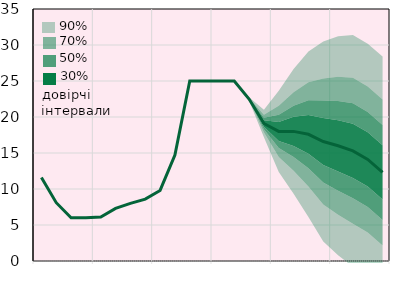
| Category | Облікова ставка, % |
|---|---|
|  | 11.6 |
|  | 8.1 |
|  | 6 |
| IV.20 | 6 |
|  | 6.1 |
|  | 7.3 |
|  | 8 |
| IV.21 | 8.6 |
|  | 9.8 |
|  | 14.7 |
|  | 25 |
| IV.22 | 25 |
|  | 25 |
|  | 25 |
|  | 22.5 |
| IV.23 | 19.1 |
|  | 18 |
|  | 18 |
|  | 17.6 |
| IV.24 | 16.6 |
|  | 16 |
|  | 15.3 |
|  | 14.1 |
| IV.25 | 12.3 |